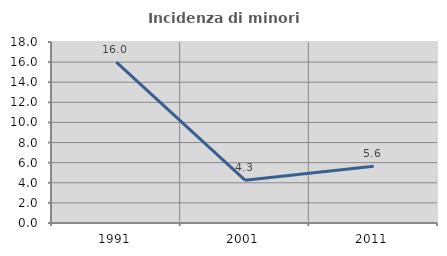
| Category | Incidenza di minori stranieri |
|---|---|
| 1991.0 | 16 |
| 2001.0 | 4.255 |
| 2011.0 | 5.641 |